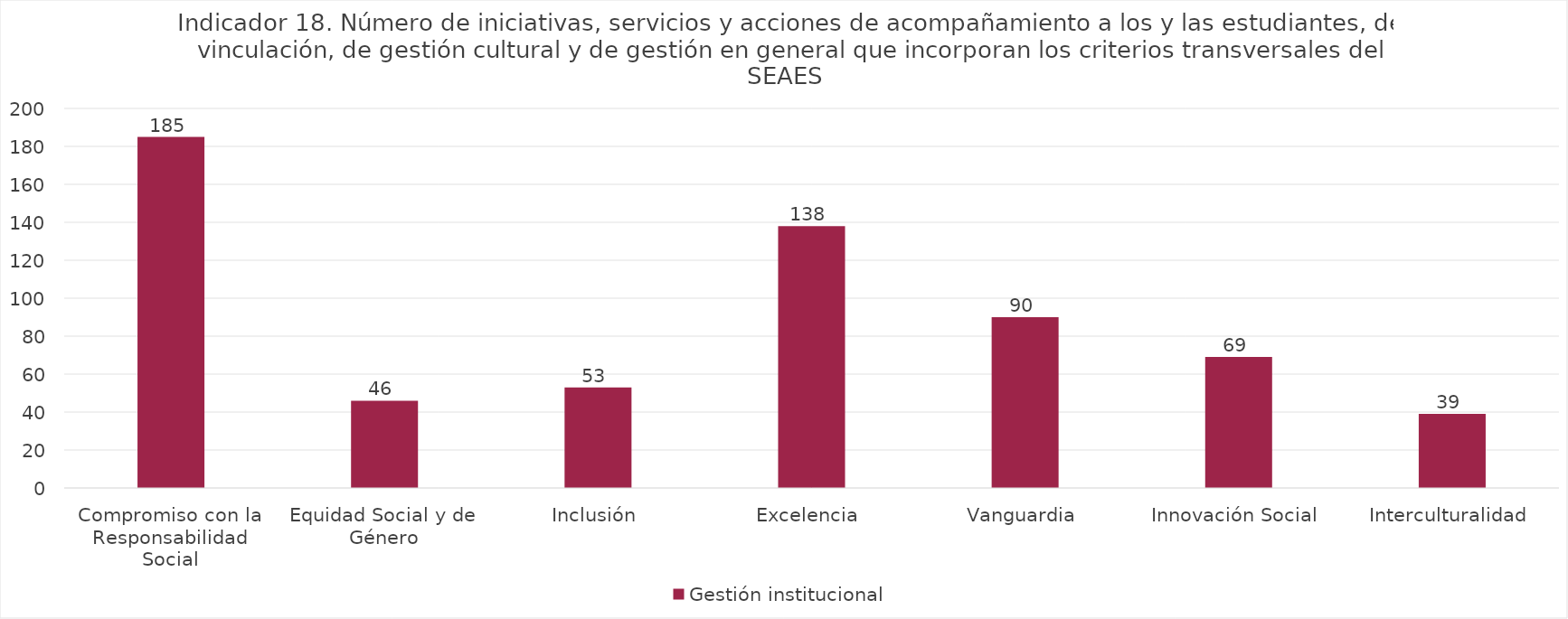
| Category | Gestión institucional |
|---|---|
| Compromiso con la Responsabilidad Social | 185 |
| Equidad Social y de Género | 46 |
| Inclusión | 53 |
| Excelencia | 138 |
| Vanguardia | 90 |
| Innovación Social | 69 |
| Interculturalidad | 39 |